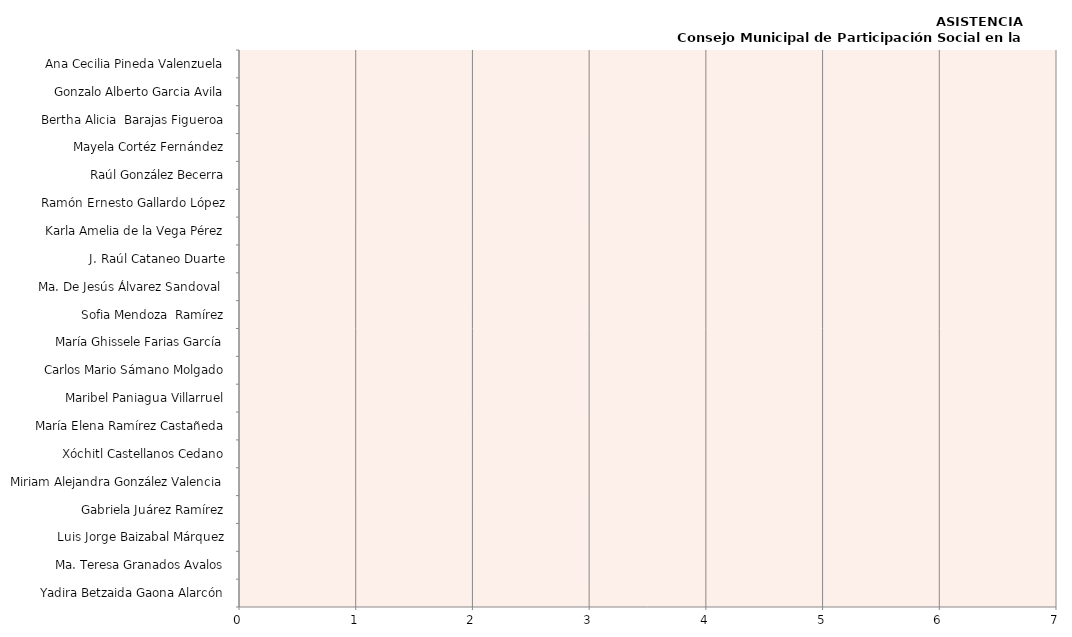
| Category | Series 0 |
|---|---|
| Yadira Betzaida Gaona Alarcón | 0 |
| Ma. Teresa Granados Avalos | 0 |
| Luis Jorge Baizabal Márquez | 0 |
| Gabriela Juárez Ramírez | 0 |
| Miriam Alejandra González Valencia | 0 |
| Xóchitl Castellanos Cedano | 0 |
| María Elena Ramírez Castañeda | 0 |
| Maribel Paniagua Villarruel | 0 |
| Carlos Mario Sámano Molgado | 0 |
| María Ghissele Farias García | 0 |
| Sofia Mendoza  Ramírez | 0 |
| Ma. De Jesús Álvarez Sandoval  | 0 |
|  J. Raúl Cataneo Duarte | 0 |
|  Karla Amelia de la Vega Pérez | 0 |
| Ramón Ernesto Gallardo López | 0 |
| Raúl González Becerra | 0 |
| Mayela Cortéz Fernández | 0 |
| Bertha Alicia  Barajas Figueroa | 0 |
| Gonzalo Alberto Garcia Avila | 0 |
| Ana Cecilia Pineda Valenzuela | 0 |